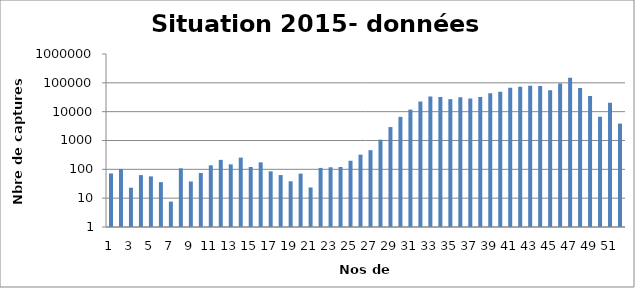
| Category | Series 0 |
|---|---|
| 0 | 72 |
| 1 | 103 |
| 2 | 23 |
| 3 | 63 |
| 4 | 57 |
| 5 | 36 |
| 6 | 7.6 |
| 7 | 108.6 |
| 8 | 37.9 |
| 9 | 74.9 |
| 10 | 137.9 |
| 11 | 213 |
| 12 | 149 |
| 13 | 254.3 |
| 14 | 120.6 |
| 15 | 174.6 |
| 16 | 85.1 |
| 17 | 63.3 |
| 18 | 38.5 |
| 19 | 71 |
| 20 | 23.5 |
| 21 | 112 |
| 22 | 117.8 |
| 23 | 120.3 |
| 24 | 198.3 |
| 25 | 323.5 |
| 26 | 461.3 |
| 27 | 1070.3 |
| 28 | 2923.1 |
| 29 | 6602.8 |
| 30 | 11800.3 |
| 31 | 22540.5 |
| 32 | 33575.5 |
| 33 | 32191.2 |
| 34 | 27213.7 |
| 35 | 31939.2 |
| 36 | 28494.5 |
| 37 | 31994 |
| 38 | 43736.5 |
| 39 | 49289 |
| 40 | 67734 |
| 41 | 73188.5 |
| 42 | 79198.5 |
| 43 | 76934.5 |
| 44 | 55355.8 |
| 45 | 95734.8 |
| 46 | 151199 |
| 47 | 66418 |
| 48 | 35048 |
| 49 | 6647.4 |
| 50 | 20400.6 |
| 51 | 3858.6 |